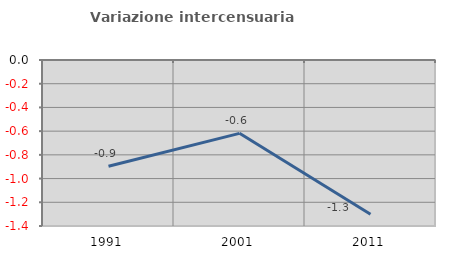
| Category | Variazione intercensuaria annua |
|---|---|
| 1991.0 | -0.896 |
| 2001.0 | -0.618 |
| 2011.0 | -1.301 |